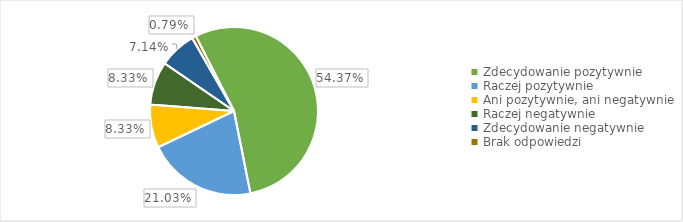
| Category | Series 0 |
|---|---|
| Zdecydowanie pozytywnie | 0.544 |
| Raczej pozytywnie | 0.21 |
| Ani pozytywnie, ani negatywnie | 0.083 |
| Raczej negatywnie | 0.083 |
| Zdecydowanie negatywnie | 0.071 |
| Brak odpowiedzi | 0.008 |